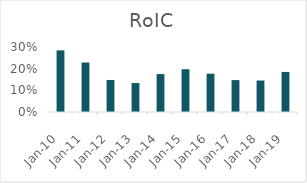
| Category | RoIC |
|---|---|
| 2010-03-31 | 0.284 |
| 2011-03-31 | 0.228 |
| 2012-03-31 | 0.148 |
| 2013-03-31 | 0.134 |
| 2014-03-31 | 0.175 |
| 2015-03-31 | 0.197 |
| 2016-03-31 | 0.177 |
| 2017-03-31 | 0.147 |
| 2018-03-31 | 0.145 |
| 2019-03-31 | 0.185 |